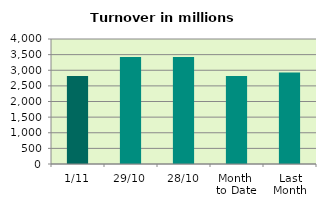
| Category | Series 0 |
|---|---|
| 1/11 | 2816.193 |
| 29/10 | 3422.365 |
| 28/10 | 3421.393 |
| Month 
to Date | 2816.193 |
| Last
Month | 2924.951 |